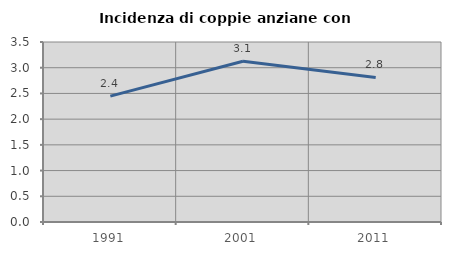
| Category | Incidenza di coppie anziane con figli |
|---|---|
| 1991.0 | 2.448 |
| 2001.0 | 3.125 |
| 2011.0 | 2.81 |